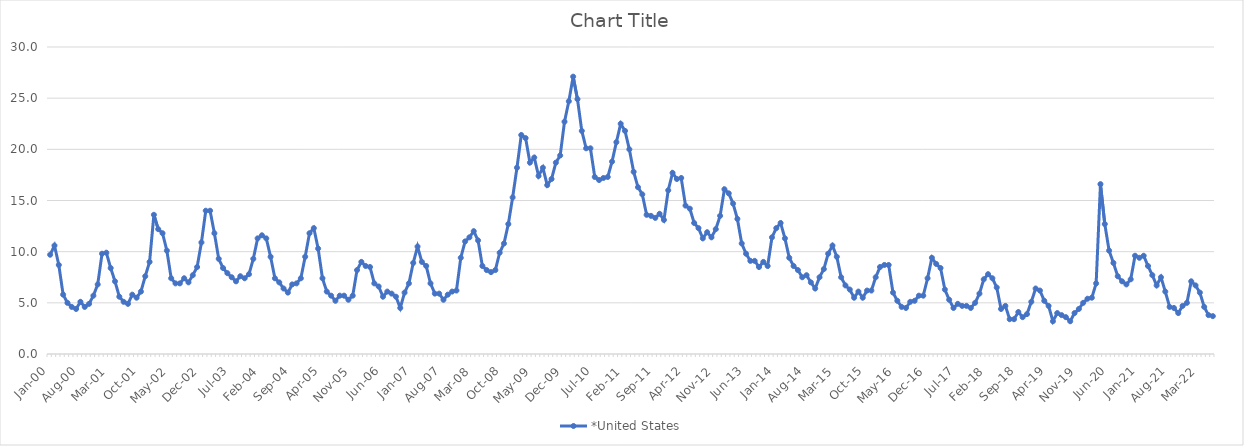
| Category | *United States | Alaska | Alabama | Arkansas | Arizona | California | Colorado | Connecticut | Delaware | Florida | Georgia | Hawaii | Iowa | Idaho | Illinois | Indiana | Kansas | Kentucky | Louisiana | Massachusetts | Maryland | Maine | Michigan | Minnesota | Missouri | Mississippi | Montana | North Carolina | North Dakota | Nebraska | New Hampshire | New Jersey | New Mexico | Nevada | New York | Ohio | Oklahoma | Oregon | Pennsylvania | Rhode Island | South Carolina | South Dakota | Tennessee | Texas | Utah | Virginia | Vermont | Washington | Wisconsin | West Virginia | Wyoming |
|---|---|---|---|---|---|---|---|---|---|---|---|---|---|---|---|---|---|---|---|---|---|---|---|---|---|---|---|---|---|---|---|---|---|---|---|---|---|---|---|---|---|---|---|---|---|---|---|---|---|---|---|
| Jan-00 | 9.7 |  |  |  |  |  |  |  |  |  |  |  |  |  |  |  |  |  |  |  |  |  |  |  |  |  |  |  |  |  |  |  |  |  |  |  |  |  |  |  |  |  |  |  |  |  |  |  |  |  |  |
| Feb-00 | 10.6 |  |  |  |  |  |  |  |  |  |  |  |  |  |  |  |  |  |  |  |  |  |  |  |  |  |  |  |  |  |  |  |  |  |  |  |  |  |  |  |  |  |  |  |  |  |  |  |  |  |  |
| Mar-00 | 8.7 |  |  |  |  |  |  |  |  |  |  |  |  |  |  |  |  |  |  |  |  |  |  |  |  |  |  |  |  |  |  |  |  |  |  |  |  |  |  |  |  |  |  |  |  |  |  |  |  |  |  |
| Apr-00 | 5.8 |  |  |  |  |  |  |  |  |  |  |  |  |  |  |  |  |  |  |  |  |  |  |  |  |  |  |  |  |  |  |  |  |  |  |  |  |  |  |  |  |  |  |  |  |  |  |  |  |  |  |
| May-00 | 5 |  |  |  |  |  |  |  |  |  |  |  |  |  |  |  |  |  |  |  |  |  |  |  |  |  |  |  |  |  |  |  |  |  |  |  |  |  |  |  |  |  |  |  |  |  |  |  |  |  |  |
| Jun-00 | 4.6 |  |  |  |  |  |  |  |  |  |  |  |  |  |  |  |  |  |  |  |  |  |  |  |  |  |  |  |  |  |  |  |  |  |  |  |  |  |  |  |  |  |  |  |  |  |  |  |  |  |  |
| Jul-00 | 4.4 |  |  |  |  |  |  |  |  |  |  |  |  |  |  |  |  |  |  |  |  |  |  |  |  |  |  |  |  |  |  |  |  |  |  |  |  |  |  |  |  |  |  |  |  |  |  |  |  |  |  |
| Aug-00 | 5.1 |  |  |  |  |  |  |  |  |  |  |  |  |  |  |  |  |  |  |  |  |  |  |  |  |  |  |  |  |  |  |  |  |  |  |  |  |  |  |  |  |  |  |  |  |  |  |  |  |  |  |
| Sep-00 | 4.6 |  |  |  |  |  |  |  |  |  |  |  |  |  |  |  |  |  |  |  |  |  |  |  |  |  |  |  |  |  |  |  |  |  |  |  |  |  |  |  |  |  |  |  |  |  |  |  |  |  |  |
| Oct-00 | 4.9 |  |  |  |  |  |  |  |  |  |  |  |  |  |  |  |  |  |  |  |  |  |  |  |  |  |  |  |  |  |  |  |  |  |  |  |  |  |  |  |  |  |  |  |  |  |  |  |  |  |  |
| Nov-00 | 5.7 |  |  |  |  |  |  |  |  |  |  |  |  |  |  |  |  |  |  |  |  |  |  |  |  |  |  |  |  |  |  |  |  |  |  |  |  |  |  |  |  |  |  |  |  |  |  |  |  |  |  |
| Dec-00 | 6.8 |  |  |  |  |  |  |  |  |  |  |  |  |  |  |  |  |  |  |  |  |  |  |  |  |  |  |  |  |  |  |  |  |  |  |  |  |  |  |  |  |  |  |  |  |  |  |  |  |  |  |
| Jan-01 | 9.8 |  |  |  |  |  |  |  |  |  |  |  |  |  |  |  |  |  |  |  |  |  |  |  |  |  |  |  |  |  |  |  |  |  |  |  |  |  |  |  |  |  |  |  |  |  |  |  |  |  |  |
| Feb-01 | 9.9 |  |  |  |  |  |  |  |  |  |  |  |  |  |  |  |  |  |  |  |  |  |  |  |  |  |  |  |  |  |  |  |  |  |  |  |  |  |  |  |  |  |  |  |  |  |  |  |  |  |  |
| Mar-01 | 8.4 |  |  |  |  |  |  |  |  |  |  |  |  |  |  |  |  |  |  |  |  |  |  |  |  |  |  |  |  |  |  |  |  |  |  |  |  |  |  |  |  |  |  |  |  |  |  |  |  |  |  |
| Apr-01 | 7.1 |  |  |  |  |  |  |  |  |  |  |  |  |  |  |  |  |  |  |  |  |  |  |  |  |  |  |  |  |  |  |  |  |  |  |  |  |  |  |  |  |  |  |  |  |  |  |  |  |  |  |
| May-01 | 5.6 |  |  |  |  |  |  |  |  |  |  |  |  |  |  |  |  |  |  |  |  |  |  |  |  |  |  |  |  |  |  |  |  |  |  |  |  |  |  |  |  |  |  |  |  |  |  |  |  |  |  |
| Jun-01 | 5.1 |  |  |  |  |  |  |  |  |  |  |  |  |  |  |  |  |  |  |  |  |  |  |  |  |  |  |  |  |  |  |  |  |  |  |  |  |  |  |  |  |  |  |  |  |  |  |  |  |  |  |
| Jul-01 | 4.9 |  |  |  |  |  |  |  |  |  |  |  |  |  |  |  |  |  |  |  |  |  |  |  |  |  |  |  |  |  |  |  |  |  |  |  |  |  |  |  |  |  |  |  |  |  |  |  |  |  |  |
| Aug-01 | 5.8 |  |  |  |  |  |  |  |  |  |  |  |  |  |  |  |  |  |  |  |  |  |  |  |  |  |  |  |  |  |  |  |  |  |  |  |  |  |  |  |  |  |  |  |  |  |  |  |  |  |  |
| Sep-01 | 5.5 |  |  |  |  |  |  |  |  |  |  |  |  |  |  |  |  |  |  |  |  |  |  |  |  |  |  |  |  |  |  |  |  |  |  |  |  |  |  |  |  |  |  |  |  |  |  |  |  |  |  |
| Oct-01 | 6.1 |  |  |  |  |  |  |  |  |  |  |  |  |  |  |  |  |  |  |  |  |  |  |  |  |  |  |  |  |  |  |  |  |  |  |  |  |  |  |  |  |  |  |  |  |  |  |  |  |  |  |
| Nov-01 | 7.6 |  |  |  |  |  |  |  |  |  |  |  |  |  |  |  |  |  |  |  |  |  |  |  |  |  |  |  |  |  |  |  |  |  |  |  |  |  |  |  |  |  |  |  |  |  |  |  |  |  |  |
| Dec-01 | 9 |  |  |  |  |  |  |  |  |  |  |  |  |  |  |  |  |  |  |  |  |  |  |  |  |  |  |  |  |  |  |  |  |  |  |  |  |  |  |  |  |  |  |  |  |  |  |  |  |  |  |
| Jan-02 | 13.6 |  |  |  |  |  |  |  |  |  |  |  |  |  |  |  |  |  |  |  |  |  |  |  |  |  |  |  |  |  |  |  |  |  |  |  |  |  |  |  |  |  |  |  |  |  |  |  |  |  |  |
| Feb-02 | 12.2 |  |  |  |  |  |  |  |  |  |  |  |  |  |  |  |  |  |  |  |  |  |  |  |  |  |  |  |  |  |  |  |  |  |  |  |  |  |  |  |  |  |  |  |  |  |  |  |  |  |  |
| Mar-02 | 11.8 |  |  |  |  |  |  |  |  |  |  |  |  |  |  |  |  |  |  |  |  |  |  |  |  |  |  |  |  |  |  |  |  |  |  |  |  |  |  |  |  |  |  |  |  |  |  |  |  |  |  |
| Apr-02 | 10.1 |  |  |  |  |  |  |  |  |  |  |  |  |  |  |  |  |  |  |  |  |  |  |  |  |  |  |  |  |  |  |  |  |  |  |  |  |  |  |  |  |  |  |  |  |  |  |  |  |  |  |
| May-02 | 7.4 |  |  |  |  |  |  |  |  |  |  |  |  |  |  |  |  |  |  |  |  |  |  |  |  |  |  |  |  |  |  |  |  |  |  |  |  |  |  |  |  |  |  |  |  |  |  |  |  |  |  |
| Jun-02 | 6.9 |  |  |  |  |  |  |  |  |  |  |  |  |  |  |  |  |  |  |  |  |  |  |  |  |  |  |  |  |  |  |  |  |  |  |  |  |  |  |  |  |  |  |  |  |  |  |  |  |  |  |
| Jul-02 | 6.9 |  |  |  |  |  |  |  |  |  |  |  |  |  |  |  |  |  |  |  |  |  |  |  |  |  |  |  |  |  |  |  |  |  |  |  |  |  |  |  |  |  |  |  |  |  |  |  |  |  |  |
| Aug-02 | 7.4 |  |  |  |  |  |  |  |  |  |  |  |  |  |  |  |  |  |  |  |  |  |  |  |  |  |  |  |  |  |  |  |  |  |  |  |  |  |  |  |  |  |  |  |  |  |  |  |  |  |  |
| Sep-02 | 7 |  |  |  |  |  |  |  |  |  |  |  |  |  |  |  |  |  |  |  |  |  |  |  |  |  |  |  |  |  |  |  |  |  |  |  |  |  |  |  |  |  |  |  |  |  |  |  |  |  |  |
| Oct-02 | 7.7 |  |  |  |  |  |  |  |  |  |  |  |  |  |  |  |  |  |  |  |  |  |  |  |  |  |  |  |  |  |  |  |  |  |  |  |  |  |  |  |  |  |  |  |  |  |  |  |  |  |  |
| Nov-02 | 8.5 |  |  |  |  |  |  |  |  |  |  |  |  |  |  |  |  |  |  |  |  |  |  |  |  |  |  |  |  |  |  |  |  |  |  |  |  |  |  |  |  |  |  |  |  |  |  |  |  |  |  |
| Dec-02 | 10.9 |  |  |  |  |  |  |  |  |  |  |  |  |  |  |  |  |  |  |  |  |  |  |  |  |  |  |  |  |  |  |  |  |  |  |  |  |  |  |  |  |  |  |  |  |  |  |  |  |  |  |
| Jan-03 | 14 |  |  |  |  |  |  |  |  |  |  |  |  |  |  |  |  |  |  |  |  |  |  |  |  |  |  |  |  |  |  |  |  |  |  |  |  |  |  |  |  |  |  |  |  |  |  |  |  |  |  |
| Feb-03 | 14 |  |  |  |  |  |  |  |  |  |  |  |  |  |  |  |  |  |  |  |  |  |  |  |  |  |  |  |  |  |  |  |  |  |  |  |  |  |  |  |  |  |  |  |  |  |  |  |  |  |  |
| Mar-03 | 11.8 |  |  |  |  |  |  |  |  |  |  |  |  |  |  |  |  |  |  |  |  |  |  |  |  |  |  |  |  |  |  |  |  |  |  |  |  |  |  |  |  |  |  |  |  |  |  |  |  |  |  |
| Apr-03 | 9.3 |  |  |  |  |  |  |  |  |  |  |  |  |  |  |  |  |  |  |  |  |  |  |  |  |  |  |  |  |  |  |  |  |  |  |  |  |  |  |  |  |  |  |  |  |  |  |  |  |  |  |
| May-03 | 8.4 |  |  |  |  |  |  |  |  |  |  |  |  |  |  |  |  |  |  |  |  |  |  |  |  |  |  |  |  |  |  |  |  |  |  |  |  |  |  |  |  |  |  |  |  |  |  |  |  |  |  |
| Jun-03 | 7.9 |  |  |  |  |  |  |  |  |  |  |  |  |  |  |  |  |  |  |  |  |  |  |  |  |  |  |  |  |  |  |  |  |  |  |  |  |  |  |  |  |  |  |  |  |  |  |  |  |  |  |
| Jul-03 | 7.5 |  |  |  |  |  |  |  |  |  |  |  |  |  |  |  |  |  |  |  |  |  |  |  |  |  |  |  |  |  |  |  |  |  |  |  |  |  |  |  |  |  |  |  |  |  |  |  |  |  |  |
| Aug-03 | 7.1 |  |  |  |  |  |  |  |  |  |  |  |  |  |  |  |  |  |  |  |  |  |  |  |  |  |  |  |  |  |  |  |  |  |  |  |  |  |  |  |  |  |  |  |  |  |  |  |  |  |  |
| Sep-03 | 7.6 |  |  |  |  |  |  |  |  |  |  |  |  |  |  |  |  |  |  |  |  |  |  |  |  |  |  |  |  |  |  |  |  |  |  |  |  |  |  |  |  |  |  |  |  |  |  |  |  |  |  |
| Oct-03 | 7.4 |  |  |  |  |  |  |  |  |  |  |  |  |  |  |  |  |  |  |  |  |  |  |  |  |  |  |  |  |  |  |  |  |  |  |  |  |  |  |  |  |  |  |  |  |  |  |  |  |  |  |
| Nov-03 | 7.8 |  |  |  |  |  |  |  |  |  |  |  |  |  |  |  |  |  |  |  |  |  |  |  |  |  |  |  |  |  |  |  |  |  |  |  |  |  |  |  |  |  |  |  |  |  |  |  |  |  |  |
| Dec-03 | 9.3 |  |  |  |  |  |  |  |  |  |  |  |  |  |  |  |  |  |  |  |  |  |  |  |  |  |  |  |  |  |  |  |  |  |  |  |  |  |  |  |  |  |  |  |  |  |  |  |  |  |  |
| Jan-04 | 11.3 |  |  |  |  |  |  |  |  |  |  |  |  |  |  |  |  |  |  |  |  |  |  |  |  |  |  |  |  |  |  |  |  |  |  |  |  |  |  |  |  |  |  |  |  |  |  |  |  |  |  |
| Feb-04 | 11.6 |  |  |  |  |  |  |  |  |  |  |  |  |  |  |  |  |  |  |  |  |  |  |  |  |  |  |  |  |  |  |  |  |  |  |  |  |  |  |  |  |  |  |  |  |  |  |  |  |  |  |
| Mar-04 | 11.3 |  |  |  |  |  |  |  |  |  |  |  |  |  |  |  |  |  |  |  |  |  |  |  |  |  |  |  |  |  |  |  |  |  |  |  |  |  |  |  |  |  |  |  |  |  |  |  |  |  |  |
| Apr-04 | 9.5 |  |  |  |  |  |  |  |  |  |  |  |  |  |  |  |  |  |  |  |  |  |  |  |  |  |  |  |  |  |  |  |  |  |  |  |  |  |  |  |  |  |  |  |  |  |  |  |  |  |  |
| May-04 | 7.4 |  |  |  |  |  |  |  |  |  |  |  |  |  |  |  |  |  |  |  |  |  |  |  |  |  |  |  |  |  |  |  |  |  |  |  |  |  |  |  |  |  |  |  |  |  |  |  |  |  |  |
| Jun-04 | 7 |  |  |  |  |  |  |  |  |  |  |  |  |  |  |  |  |  |  |  |  |  |  |  |  |  |  |  |  |  |  |  |  |  |  |  |  |  |  |  |  |  |  |  |  |  |  |  |  |  |  |
| Jul-04 | 6.4 |  |  |  |  |  |  |  |  |  |  |  |  |  |  |  |  |  |  |  |  |  |  |  |  |  |  |  |  |  |  |  |  |  |  |  |  |  |  |  |  |  |  |  |  |  |  |  |  |  |  |
| Aug-04 | 6 |  |  |  |  |  |  |  |  |  |  |  |  |  |  |  |  |  |  |  |  |  |  |  |  |  |  |  |  |  |  |  |  |  |  |  |  |  |  |  |  |  |  |  |  |  |  |  |  |  |  |
| Sep-04 | 6.8 |  |  |  |  |  |  |  |  |  |  |  |  |  |  |  |  |  |  |  |  |  |  |  |  |  |  |  |  |  |  |  |  |  |  |  |  |  |  |  |  |  |  |  |  |  |  |  |  |  |  |
| Oct-04 | 6.9 |  |  |  |  |  |  |  |  |  |  |  |  |  |  |  |  |  |  |  |  |  |  |  |  |  |  |  |  |  |  |  |  |  |  |  |  |  |  |  |  |  |  |  |  |  |  |  |  |  |  |
| Nov-04 | 7.4 |  |  |  |  |  |  |  |  |  |  |  |  |  |  |  |  |  |  |  |  |  |  |  |  |  |  |  |  |  |  |  |  |  |  |  |  |  |  |  |  |  |  |  |  |  |  |  |  |  |  |
| Dec-04 | 9.5 |  |  |  |  |  |  |  |  |  |  |  |  |  |  |  |  |  |  |  |  |  |  |  |  |  |  |  |  |  |  |  |  |  |  |  |  |  |  |  |  |  |  |  |  |  |  |  |  |  |  |
| Jan-05 | 11.8 |  |  |  |  |  |  |  |  |  |  |  |  |  |  |  |  |  |  |  |  |  |  |  |  |  |  |  |  |  |  |  |  |  |  |  |  |  |  |  |  |  |  |  |  |  |  |  |  |  |  |
| Feb-05 | 12.3 |  |  |  |  |  |  |  |  |  |  |  |  |  |  |  |  |  |  |  |  |  |  |  |  |  |  |  |  |  |  |  |  |  |  |  |  |  |  |  |  |  |  |  |  |  |  |  |  |  |  |
| Mar-05 | 10.3 |  |  |  |  |  |  |  |  |  |  |  |  |  |  |  |  |  |  |  |  |  |  |  |  |  |  |  |  |  |  |  |  |  |  |  |  |  |  |  |  |  |  |  |  |  |  |  |  |  |  |
| Apr-05 | 7.4 |  |  |  |  |  |  |  |  |  |  |  |  |  |  |  |  |  |  |  |  |  |  |  |  |  |  |  |  |  |  |  |  |  |  |  |  |  |  |  |  |  |  |  |  |  |  |  |  |  |  |
| May-05 | 6.1 |  |  |  |  |  |  |  |  |  |  |  |  |  |  |  |  |  |  |  |  |  |  |  |  |  |  |  |  |  |  |  |  |  |  |  |  |  |  |  |  |  |  |  |  |  |  |  |  |  |  |
| Jun-05 | 5.7 |  |  |  |  |  |  |  |  |  |  |  |  |  |  |  |  |  |  |  |  |  |  |  |  |  |  |  |  |  |  |  |  |  |  |  |  |  |  |  |  |  |  |  |  |  |  |  |  |  |  |
| Jul-05 | 5.2 |  |  |  |  |  |  |  |  |  |  |  |  |  |  |  |  |  |  |  |  |  |  |  |  |  |  |  |  |  |  |  |  |  |  |  |  |  |  |  |  |  |  |  |  |  |  |  |  |  |  |
| Aug-05 | 5.7 |  |  |  |  |  |  |  |  |  |  |  |  |  |  |  |  |  |  |  |  |  |  |  |  |  |  |  |  |  |  |  |  |  |  |  |  |  |  |  |  |  |  |  |  |  |  |  |  |  |  |
| Sep-05 | 5.7 |  |  |  |  |  |  |  |  |  |  |  |  |  |  |  |  |  |  |  |  |  |  |  |  |  |  |  |  |  |  |  |  |  |  |  |  |  |  |  |  |  |  |  |  |  |  |  |  |  |  |
| Oct-05 | 5.3 |  |  |  |  |  |  |  |  |  |  |  |  |  |  |  |  |  |  |  |  |  |  |  |  |  |  |  |  |  |  |  |  |  |  |  |  |  |  |  |  |  |  |  |  |  |  |  |  |  |  |
| Nov-05 | 5.7 |  |  |  |  |  |  |  |  |  |  |  |  |  |  |  |  |  |  |  |  |  |  |  |  |  |  |  |  |  |  |  |  |  |  |  |  |  |  |  |  |  |  |  |  |  |  |  |  |  |  |
| Dec-05 | 8.2 |  |  |  |  |  |  |  |  |  |  |  |  |  |  |  |  |  |  |  |  |  |  |  |  |  |  |  |  |  |  |  |  |  |  |  |  |  |  |  |  |  |  |  |  |  |  |  |  |  |  |
| Jan-06 | 9 |  |  |  |  |  |  |  |  |  |  |  |  |  |  |  |  |  |  |  |  |  |  |  |  |  |  |  |  |  |  |  |  |  |  |  |  |  |  |  |  |  |  |  |  |  |  |  |  |  |  |
| Feb-06 | 8.6 |  |  |  |  |  |  |  |  |  |  |  |  |  |  |  |  |  |  |  |  |  |  |  |  |  |  |  |  |  |  |  |  |  |  |  |  |  |  |  |  |  |  |  |  |  |  |  |  |  |  |
| Mar-06 | 8.5 |  |  |  |  |  |  |  |  |  |  |  |  |  |  |  |  |  |  |  |  |  |  |  |  |  |  |  |  |  |  |  |  |  |  |  |  |  |  |  |  |  |  |  |  |  |  |  |  |  |  |
| Apr-06 | 6.9 |  |  |  |  |  |  |  |  |  |  |  |  |  |  |  |  |  |  |  |  |  |  |  |  |  |  |  |  |  |  |  |  |  |  |  |  |  |  |  |  |  |  |  |  |  |  |  |  |  |  |
| May-06 | 6.6 |  |  |  |  |  |  |  |  |  |  |  |  |  |  |  |  |  |  |  |  |  |  |  |  |  |  |  |  |  |  |  |  |  |  |  |  |  |  |  |  |  |  |  |  |  |  |  |  |  |  |
| Jun-06 | 5.6 |  |  |  |  |  |  |  |  |  |  |  |  |  |  |  |  |  |  |  |  |  |  |  |  |  |  |  |  |  |  |  |  |  |  |  |  |  |  |  |  |  |  |  |  |  |  |  |  |  |  |
| Jul-06 | 6.1 |  |  |  |  |  |  |  |  |  |  |  |  |  |  |  |  |  |  |  |  |  |  |  |  |  |  |  |  |  |  |  |  |  |  |  |  |  |  |  |  |  |  |  |  |  |  |  |  |  |  |
| Aug-06 | 5.9 |  |  |  |  |  |  |  |  |  |  |  |  |  |  |  |  |  |  |  |  |  |  |  |  |  |  |  |  |  |  |  |  |  |  |  |  |  |  |  |  |  |  |  |  |  |  |  |  |  |  |
| Sep-06 | 5.6 |  |  |  |  |  |  |  |  |  |  |  |  |  |  |  |  |  |  |  |  |  |  |  |  |  |  |  |  |  |  |  |  |  |  |  |  |  |  |  |  |  |  |  |  |  |  |  |  |  |  |
| Oct-06 | 4.5 |  |  |  |  |  |  |  |  |  |  |  |  |  |  |  |  |  |  |  |  |  |  |  |  |  |  |  |  |  |  |  |  |  |  |  |  |  |  |  |  |  |  |  |  |  |  |  |  |  |  |
| Nov-06 | 6 |  |  |  |  |  |  |  |  |  |  |  |  |  |  |  |  |  |  |  |  |  |  |  |  |  |  |  |  |  |  |  |  |  |  |  |  |  |  |  |  |  |  |  |  |  |  |  |  |  |  |
| Dec-06 | 6.9 |  |  |  |  |  |  |  |  |  |  |  |  |  |  |  |  |  |  |  |  |  |  |  |  |  |  |  |  |  |  |  |  |  |  |  |  |  |  |  |  |  |  |  |  |  |  |  |  |  |  |
| Jan-07 | 8.9 |  |  |  |  |  |  |  |  |  |  |  |  |  |  |  |  |  |  |  |  |  |  |  |  |  |  |  |  |  |  |  |  |  |  |  |  |  |  |  |  |  |  |  |  |  |  |  |  |  |  |
| Feb-07 | 10.5 |  |  |  |  |  |  |  |  |  |  |  |  |  |  |  |  |  |  |  |  |  |  |  |  |  |  |  |  |  |  |  |  |  |  |  |  |  |  |  |  |  |  |  |  |  |  |  |  |  |  |
| Mar-07 | 9 |  |  |  |  |  |  |  |  |  |  |  |  |  |  |  |  |  |  |  |  |  |  |  |  |  |  |  |  |  |  |  |  |  |  |  |  |  |  |  |  |  |  |  |  |  |  |  |  |  |  |
| Apr-07 | 8.6 |  |  |  |  |  |  |  |  |  |  |  |  |  |  |  |  |  |  |  |  |  |  |  |  |  |  |  |  |  |  |  |  |  |  |  |  |  |  |  |  |  |  |  |  |  |  |  |  |  |  |
| May-07 | 6.9 |  |  |  |  |  |  |  |  |  |  |  |  |  |  |  |  |  |  |  |  |  |  |  |  |  |  |  |  |  |  |  |  |  |  |  |  |  |  |  |  |  |  |  |  |  |  |  |  |  |  |
| Jun-07 | 5.9 |  |  |  |  |  |  |  |  |  |  |  |  |  |  |  |  |  |  |  |  |  |  |  |  |  |  |  |  |  |  |  |  |  |  |  |  |  |  |  |  |  |  |  |  |  |  |  |  |  |  |
| Jul-07 | 5.9 |  |  |  |  |  |  |  |  |  |  |  |  |  |  |  |  |  |  |  |  |  |  |  |  |  |  |  |  |  |  |  |  |  |  |  |  |  |  |  |  |  |  |  |  |  |  |  |  |  |  |
| Aug-07 | 5.3 |  |  |  |  |  |  |  |  |  |  |  |  |  |  |  |  |  |  |  |  |  |  |  |  |  |  |  |  |  |  |  |  |  |  |  |  |  |  |  |  |  |  |  |  |  |  |  |  |  |  |
| Sep-07 | 5.8 |  |  |  |  |  |  |  |  |  |  |  |  |  |  |  |  |  |  |  |  |  |  |  |  |  |  |  |  |  |  |  |  |  |  |  |  |  |  |  |  |  |  |  |  |  |  |  |  |  |  |
| Oct-07 | 6.1 |  |  |  |  |  |  |  |  |  |  |  |  |  |  |  |  |  |  |  |  |  |  |  |  |  |  |  |  |  |  |  |  |  |  |  |  |  |  |  |  |  |  |  |  |  |  |  |  |  |  |
| Nov-07 | 6.2 |  |  |  |  |  |  |  |  |  |  |  |  |  |  |  |  |  |  |  |  |  |  |  |  |  |  |  |  |  |  |  |  |  |  |  |  |  |  |  |  |  |  |  |  |  |  |  |  |  |  |
| Dec-07 | 9.4 |  |  |  |  |  |  |  |  |  |  |  |  |  |  |  |  |  |  |  |  |  |  |  |  |  |  |  |  |  |  |  |  |  |  |  |  |  |  |  |  |  |  |  |  |  |  |  |  |  |  |
| Jan-08 | 11 |  |  |  |  |  |  |  |  |  |  |  |  |  |  |  |  |  |  |  |  |  |  |  |  |  |  |  |  |  |  |  |  |  |  |  |  |  |  |  |  |  |  |  |  |  |  |  |  |  |  |
| Feb-08 | 11.4 |  |  |  |  |  |  |  |  |  |  |  |  |  |  |  |  |  |  |  |  |  |  |  |  |  |  |  |  |  |  |  |  |  |  |  |  |  |  |  |  |  |  |  |  |  |  |  |  |  |  |
| Mar-08 | 12 |  |  |  |  |  |  |  |  |  |  |  |  |  |  |  |  |  |  |  |  |  |  |  |  |  |  |  |  |  |  |  |  |  |  |  |  |  |  |  |  |  |  |  |  |  |  |  |  |  |  |
| Apr-08 | 11.1 |  |  |  |  |  |  |  |  |  |  |  |  |  |  |  |  |  |  |  |  |  |  |  |  |  |  |  |  |  |  |  |  |  |  |  |  |  |  |  |  |  |  |  |  |  |  |  |  |  |  |
| May-08 | 8.6 |  |  |  |  |  |  |  |  |  |  |  |  |  |  |  |  |  |  |  |  |  |  |  |  |  |  |  |  |  |  |  |  |  |  |  |  |  |  |  |  |  |  |  |  |  |  |  |  |  |  |
| Jun-08 | 8.2 |  |  |  |  |  |  |  |  |  |  |  |  |  |  |  |  |  |  |  |  |  |  |  |  |  |  |  |  |  |  |  |  |  |  |  |  |  |  |  |  |  |  |  |  |  |  |  |  |  |  |
| Jul-08 | 8 |  |  |  |  |  |  |  |  |  |  |  |  |  |  |  |  |  |  |  |  |  |  |  |  |  |  |  |  |  |  |  |  |  |  |  |  |  |  |  |  |  |  |  |  |  |  |  |  |  |  |
| Aug-08 | 8.2 |  |  |  |  |  |  |  |  |  |  |  |  |  |  |  |  |  |  |  |  |  |  |  |  |  |  |  |  |  |  |  |  |  |  |  |  |  |  |  |  |  |  |  |  |  |  |  |  |  |  |
| Sep-08 | 9.9 |  |  |  |  |  |  |  |  |  |  |  |  |  |  |  |  |  |  |  |  |  |  |  |  |  |  |  |  |  |  |  |  |  |  |  |  |  |  |  |  |  |  |  |  |  |  |  |  |  |  |
| Oct-08 | 10.8 |  |  |  |  |  |  |  |  |  |  |  |  |  |  |  |  |  |  |  |  |  |  |  |  |  |  |  |  |  |  |  |  |  |  |  |  |  |  |  |  |  |  |  |  |  |  |  |  |  |  |
| Nov-08 | 12.7 |  |  |  |  |  |  |  |  |  |  |  |  |  |  |  |  |  |  |  |  |  |  |  |  |  |  |  |  |  |  |  |  |  |  |  |  |  |  |  |  |  |  |  |  |  |  |  |  |  |  |
| Dec-08 | 15.3 |  |  |  |  |  |  |  |  |  |  |  |  |  |  |  |  |  |  |  |  |  |  |  |  |  |  |  |  |  |  |  |  |  |  |  |  |  |  |  |  |  |  |  |  |  |  |  |  |  |  |
| Jan-09 | 18.2 |  |  |  |  |  |  |  |  |  |  |  |  |  |  |  |  |  |  |  |  |  |  |  |  |  |  |  |  |  |  |  |  |  |  |  |  |  |  |  |  |  |  |  |  |  |  |  |  |  |  |
| Feb-09 | 21.4 |  |  |  |  |  |  |  |  |  |  |  |  |  |  |  |  |  |  |  |  |  |  |  |  |  |  |  |  |  |  |  |  |  |  |  |  |  |  |  |  |  |  |  |  |  |  |  |  |  |  |
| Mar-09 | 21.1 |  |  |  |  |  |  |  |  |  |  |  |  |  |  |  |  |  |  |  |  |  |  |  |  |  |  |  |  |  |  |  |  |  |  |  |  |  |  |  |  |  |  |  |  |  |  |  |  |  |  |
| Apr-09 | 18.7 |  |  |  |  |  |  |  |  |  |  |  |  |  |  |  |  |  |  |  |  |  |  |  |  |  |  |  |  |  |  |  |  |  |  |  |  |  |  |  |  |  |  |  |  |  |  |  |  |  |  |
| May-09 | 19.2 |  |  |  |  |  |  |  |  |  |  |  |  |  |  |  |  |  |  |  |  |  |  |  |  |  |  |  |  |  |  |  |  |  |  |  |  |  |  |  |  |  |  |  |  |  |  |  |  |  |  |
| Jun-09 | 17.4 |  |  |  |  |  |  |  |  |  |  |  |  |  |  |  |  |  |  |  |  |  |  |  |  |  |  |  |  |  |  |  |  |  |  |  |  |  |  |  |  |  |  |  |  |  |  |  |  |  |  |
| Jul-09 | 18.2 |  |  |  |  |  |  |  |  |  |  |  |  |  |  |  |  |  |  |  |  |  |  |  |  |  |  |  |  |  |  |  |  |  |  |  |  |  |  |  |  |  |  |  |  |  |  |  |  |  |  |
| Aug-09 | 16.5 |  |  |  |  |  |  |  |  |  |  |  |  |  |  |  |  |  |  |  |  |  |  |  |  |  |  |  |  |  |  |  |  |  |  |  |  |  |  |  |  |  |  |  |  |  |  |  |  |  |  |
| Sep-09 | 17.1 |  |  |  |  |  |  |  |  |  |  |  |  |  |  |  |  |  |  |  |  |  |  |  |  |  |  |  |  |  |  |  |  |  |  |  |  |  |  |  |  |  |  |  |  |  |  |  |  |  |  |
| Oct-09 | 18.7 |  |  |  |  |  |  |  |  |  |  |  |  |  |  |  |  |  |  |  |  |  |  |  |  |  |  |  |  |  |  |  |  |  |  |  |  |  |  |  |  |  |  |  |  |  |  |  |  |  |  |
| Nov-09 | 19.4 |  |  |  |  |  |  |  |  |  |  |  |  |  |  |  |  |  |  |  |  |  |  |  |  |  |  |  |  |  |  |  |  |  |  |  |  |  |  |  |  |  |  |  |  |  |  |  |  |  |  |
| Dec-09 | 22.7 |  |  |  |  |  |  |  |  |  |  |  |  |  |  |  |  |  |  |  |  |  |  |  |  |  |  |  |  |  |  |  |  |  |  |  |  |  |  |  |  |  |  |  |  |  |  |  |  |  |  |
| Jan-10 | 24.7 |  |  |  |  |  |  |  |  |  |  |  |  |  |  |  |  |  |  |  |  |  |  |  |  |  |  |  |  |  |  |  |  |  |  |  |  |  |  |  |  |  |  |  |  |  |  |  |  |  |  |
| Feb-10 | 27.1 |  |  |  |  |  |  |  |  |  |  |  |  |  |  |  |  |  |  |  |  |  |  |  |  |  |  |  |  |  |  |  |  |  |  |  |  |  |  |  |  |  |  |  |  |  |  |  |  |  |  |
| Mar-10 | 24.9 |  |  |  |  |  |  |  |  |  |  |  |  |  |  |  |  |  |  |  |  |  |  |  |  |  |  |  |  |  |  |  |  |  |  |  |  |  |  |  |  |  |  |  |  |  |  |  |  |  |  |
| Apr-10 | 21.8 |  |  |  |  |  |  |  |  |  |  |  |  |  |  |  |  |  |  |  |  |  |  |  |  |  |  |  |  |  |  |  |  |  |  |  |  |  |  |  |  |  |  |  |  |  |  |  |  |  |  |
| May-10 | 20.1 |  |  |  |  |  |  |  |  |  |  |  |  |  |  |  |  |  |  |  |  |  |  |  |  |  |  |  |  |  |  |  |  |  |  |  |  |  |  |  |  |  |  |  |  |  |  |  |  |  |  |
| Jun-10 | 20.1 |  |  |  |  |  |  |  |  |  |  |  |  |  |  |  |  |  |  |  |  |  |  |  |  |  |  |  |  |  |  |  |  |  |  |  |  |  |  |  |  |  |  |  |  |  |  |  |  |  |  |
| Jul-10 | 17.3 |  |  |  |  |  |  |  |  |  |  |  |  |  |  |  |  |  |  |  |  |  |  |  |  |  |  |  |  |  |  |  |  |  |  |  |  |  |  |  |  |  |  |  |  |  |  |  |  |  |  |
| Aug-10 | 17 |  |  |  |  |  |  |  |  |  |  |  |  |  |  |  |  |  |  |  |  |  |  |  |  |  |  |  |  |  |  |  |  |  |  |  |  |  |  |  |  |  |  |  |  |  |  |  |  |  |  |
| Sep-10 | 17.2 |  |  |  |  |  |  |  |  |  |  |  |  |  |  |  |  |  |  |  |  |  |  |  |  |  |  |  |  |  |  |  |  |  |  |  |  |  |  |  |  |  |  |  |  |  |  |  |  |  |  |
| Oct-10 | 17.3 |  |  |  |  |  |  |  |  |  |  |  |  |  |  |  |  |  |  |  |  |  |  |  |  |  |  |  |  |  |  |  |  |  |  |  |  |  |  |  |  |  |  |  |  |  |  |  |  |  |  |
| Nov-10 | 18.8 |  |  |  |  |  |  |  |  |  |  |  |  |  |  |  |  |  |  |  |  |  |  |  |  |  |  |  |  |  |  |  |  |  |  |  |  |  |  |  |  |  |  |  |  |  |  |  |  |  |  |
| Dec-10 | 20.7 |  |  |  |  |  |  |  |  |  |  |  |  |  |  |  |  |  |  |  |  |  |  |  |  |  |  |  |  |  |  |  |  |  |  |  |  |  |  |  |  |  |  |  |  |  |  |  |  |  |  |
| Jan-11 | 22.5 |  |  |  |  |  |  |  |  |  |  |  |  |  |  |  |  |  |  |  |  |  |  |  |  |  |  |  |  |  |  |  |  |  |  |  |  |  |  |  |  |  |  |  |  |  |  |  |  |  |  |
| Feb-11 | 21.8 |  |  |  |  |  |  |  |  |  |  |  |  |  |  |  |  |  |  |  |  |  |  |  |  |  |  |  |  |  |  |  |  |  |  |  |  |  |  |  |  |  |  |  |  |  |  |  |  |  |  |
| Mar-11 | 20 |  |  |  |  |  |  |  |  |  |  |  |  |  |  |  |  |  |  |  |  |  |  |  |  |  |  |  |  |  |  |  |  |  |  |  |  |  |  |  |  |  |  |  |  |  |  |  |  |  |  |
| Apr-11 | 17.8 |  |  |  |  |  |  |  |  |  |  |  |  |  |  |  |  |  |  |  |  |  |  |  |  |  |  |  |  |  |  |  |  |  |  |  |  |  |  |  |  |  |  |  |  |  |  |  |  |  |  |
| May-11 | 16.3 |  |  |  |  |  |  |  |  |  |  |  |  |  |  |  |  |  |  |  |  |  |  |  |  |  |  |  |  |  |  |  |  |  |  |  |  |  |  |  |  |  |  |  |  |  |  |  |  |  |  |
| Jun-11 | 15.6 |  |  |  |  |  |  |  |  |  |  |  |  |  |  |  |  |  |  |  |  |  |  |  |  |  |  |  |  |  |  |  |  |  |  |  |  |  |  |  |  |  |  |  |  |  |  |  |  |  |  |
| Jul-11 | 13.6 |  |  |  |  |  |  |  |  |  |  |  |  |  |  |  |  |  |  |  |  |  |  |  |  |  |  |  |  |  |  |  |  |  |  |  |  |  |  |  |  |  |  |  |  |  |  |  |  |  |  |
| Aug-11 | 13.5 |  |  |  |  |  |  |  |  |  |  |  |  |  |  |  |  |  |  |  |  |  |  |  |  |  |  |  |  |  |  |  |  |  |  |  |  |  |  |  |  |  |  |  |  |  |  |  |  |  |  |
| Sep-11 | 13.3 |  |  |  |  |  |  |  |  |  |  |  |  |  |  |  |  |  |  |  |  |  |  |  |  |  |  |  |  |  |  |  |  |  |  |  |  |  |  |  |  |  |  |  |  |  |  |  |  |  |  |
| Oct-11 | 13.7 |  |  |  |  |  |  |  |  |  |  |  |  |  |  |  |  |  |  |  |  |  |  |  |  |  |  |  |  |  |  |  |  |  |  |  |  |  |  |  |  |  |  |  |  |  |  |  |  |  |  |
| Nov-11 | 13.1 |  |  |  |  |  |  |  |  |  |  |  |  |  |  |  |  |  |  |  |  |  |  |  |  |  |  |  |  |  |  |  |  |  |  |  |  |  |  |  |  |  |  |  |  |  |  |  |  |  |  |
| Dec-11 | 16 |  |  |  |  |  |  |  |  |  |  |  |  |  |  |  |  |  |  |  |  |  |  |  |  |  |  |  |  |  |  |  |  |  |  |  |  |  |  |  |  |  |  |  |  |  |  |  |  |  |  |
| Jan-12 | 17.7 |  |  |  |  |  |  |  |  |  |  |  |  |  |  |  |  |  |  |  |  |  |  |  |  |  |  |  |  |  |  |  |  |  |  |  |  |  |  |  |  |  |  |  |  |  |  |  |  |  |  |
| Feb-12 | 17.1 |  |  |  |  |  |  |  |  |  |  |  |  |  |  |  |  |  |  |  |  |  |  |  |  |  |  |  |  |  |  |  |  |  |  |  |  |  |  |  |  |  |  |  |  |  |  |  |  |  |  |
| Mar-12 | 17.2 |  |  |  |  |  |  |  |  |  |  |  |  |  |  |  |  |  |  |  |  |  |  |  |  |  |  |  |  |  |  |  |  |  |  |  |  |  |  |  |  |  |  |  |  |  |  |  |  |  |  |
| Apr-12 | 14.5 |  |  |  |  |  |  |  |  |  |  |  |  |  |  |  |  |  |  |  |  |  |  |  |  |  |  |  |  |  |  |  |  |  |  |  |  |  |  |  |  |  |  |  |  |  |  |  |  |  |  |
| May-12 | 14.2 |  |  |  |  |  |  |  |  |  |  |  |  |  |  |  |  |  |  |  |  |  |  |  |  |  |  |  |  |  |  |  |  |  |  |  |  |  |  |  |  |  |  |  |  |  |  |  |  |  |  |
| Jun-12 | 12.8 |  |  |  |  |  |  |  |  |  |  |  |  |  |  |  |  |  |  |  |  |  |  |  |  |  |  |  |  |  |  |  |  |  |  |  |  |  |  |  |  |  |  |  |  |  |  |  |  |  |  |
| Jul-12 | 12.3 |  |  |  |  |  |  |  |  |  |  |  |  |  |  |  |  |  |  |  |  |  |  |  |  |  |  |  |  |  |  |  |  |  |  |  |  |  |  |  |  |  |  |  |  |  |  |  |  |  |  |
| Aug-12 | 11.3 |  |  |  |  |  |  |  |  |  |  |  |  |  |  |  |  |  |  |  |  |  |  |  |  |  |  |  |  |  |  |  |  |  |  |  |  |  |  |  |  |  |  |  |  |  |  |  |  |  |  |
| Sep-12 | 11.9 |  |  |  |  |  |  |  |  |  |  |  |  |  |  |  |  |  |  |  |  |  |  |  |  |  |  |  |  |  |  |  |  |  |  |  |  |  |  |  |  |  |  |  |  |  |  |  |  |  |  |
| Oct-12 | 11.4 |  |  |  |  |  |  |  |  |  |  |  |  |  |  |  |  |  |  |  |  |  |  |  |  |  |  |  |  |  |  |  |  |  |  |  |  |  |  |  |  |  |  |  |  |  |  |  |  |  |  |
| Nov-12 | 12.2 |  |  |  |  |  |  |  |  |  |  |  |  |  |  |  |  |  |  |  |  |  |  |  |  |  |  |  |  |  |  |  |  |  |  |  |  |  |  |  |  |  |  |  |  |  |  |  |  |  |  |
| Dec-12 | 13.5 |  |  |  |  |  |  |  |  |  |  |  |  |  |  |  |  |  |  |  |  |  |  |  |  |  |  |  |  |  |  |  |  |  |  |  |  |  |  |  |  |  |  |  |  |  |  |  |  |  |  |
| Jan-13 | 16.1 |  |  |  |  |  |  |  |  |  |  |  |  |  |  |  |  |  |  |  |  |  |  |  |  |  |  |  |  |  |  |  |  |  |  |  |  |  |  |  |  |  |  |  |  |  |  |  |  |  |  |
| Feb-13 | 15.7 |  |  |  |  |  |  |  |  |  |  |  |  |  |  |  |  |  |  |  |  |  |  |  |  |  |  |  |  |  |  |  |  |  |  |  |  |  |  |  |  |  |  |  |  |  |  |  |  |  |  |
| Mar-13 | 14.7 |  |  |  |  |  |  |  |  |  |  |  |  |  |  |  |  |  |  |  |  |  |  |  |  |  |  |  |  |  |  |  |  |  |  |  |  |  |  |  |  |  |  |  |  |  |  |  |  |  |  |
| Apr-13 | 13.2 |  |  |  |  |  |  |  |  |  |  |  |  |  |  |  |  |  |  |  |  |  |  |  |  |  |  |  |  |  |  |  |  |  |  |  |  |  |  |  |  |  |  |  |  |  |  |  |  |  |  |
| May-13 | 10.8 |  |  |  |  |  |  |  |  |  |  |  |  |  |  |  |  |  |  |  |  |  |  |  |  |  |  |  |  |  |  |  |  |  |  |  |  |  |  |  |  |  |  |  |  |  |  |  |  |  |  |
| Jun-13 | 9.8 |  |  |  |  |  |  |  |  |  |  |  |  |  |  |  |  |  |  |  |  |  |  |  |  |  |  |  |  |  |  |  |  |  |  |  |  |  |  |  |  |  |  |  |  |  |  |  |  |  |  |
| Jul-13 | 9.1 |  |  |  |  |  |  |  |  |  |  |  |  |  |  |  |  |  |  |  |  |  |  |  |  |  |  |  |  |  |  |  |  |  |  |  |  |  |  |  |  |  |  |  |  |  |  |  |  |  |  |
| Aug-13 | 9.1 |  |  |  |  |  |  |  |  |  |  |  |  |  |  |  |  |  |  |  |  |  |  |  |  |  |  |  |  |  |  |  |  |  |  |  |  |  |  |  |  |  |  |  |  |  |  |  |  |  |  |
| Sep-13 | 8.5 |  |  |  |  |  |  |  |  |  |  |  |  |  |  |  |  |  |  |  |  |  |  |  |  |  |  |  |  |  |  |  |  |  |  |  |  |  |  |  |  |  |  |  |  |  |  |  |  |  |  |
| Oct-13 | 9 |  |  |  |  |  |  |  |  |  |  |  |  |  |  |  |  |  |  |  |  |  |  |  |  |  |  |  |  |  |  |  |  |  |  |  |  |  |  |  |  |  |  |  |  |  |  |  |  |  |  |
| Nov-13 | 8.6 |  |  |  |  |  |  |  |  |  |  |  |  |  |  |  |  |  |  |  |  |  |  |  |  |  |  |  |  |  |  |  |  |  |  |  |  |  |  |  |  |  |  |  |  |  |  |  |  |  |  |
| Dec-13 | 11.4 |  |  |  |  |  |  |  |  |  |  |  |  |  |  |  |  |  |  |  |  |  |  |  |  |  |  |  |  |  |  |  |  |  |  |  |  |  |  |  |  |  |  |  |  |  |  |  |  |  |  |
| Jan-14 | 12.3 |  |  |  |  |  |  |  |  |  |  |  |  |  |  |  |  |  |  |  |  |  |  |  |  |  |  |  |  |  |  |  |  |  |  |  |  |  |  |  |  |  |  |  |  |  |  |  |  |  |  |
| Feb-14 | 12.8 |  |  |  |  |  |  |  |  |  |  |  |  |  |  |  |  |  |  |  |  |  |  |  |  |  |  |  |  |  |  |  |  |  |  |  |  |  |  |  |  |  |  |  |  |  |  |  |  |  |  |
| Mar-14 | 11.3 |  |  |  |  |  |  |  |  |  |  |  |  |  |  |  |  |  |  |  |  |  |  |  |  |  |  |  |  |  |  |  |  |  |  |  |  |  |  |  |  |  |  |  |  |  |  |  |  |  |  |
| Apr-14 | 9.4 |  |  |  |  |  |  |  |  |  |  |  |  |  |  |  |  |  |  |  |  |  |  |  |  |  |  |  |  |  |  |  |  |  |  |  |  |  |  |  |  |  |  |  |  |  |  |  |  |  |  |
| May-14 | 8.6 |  |  |  |  |  |  |  |  |  |  |  |  |  |  |  |  |  |  |  |  |  |  |  |  |  |  |  |  |  |  |  |  |  |  |  |  |  |  |  |  |  |  |  |  |  |  |  |  |  |  |
| Jun-14 | 8.2 |  |  |  |  |  |  |  |  |  |  |  |  |  |  |  |  |  |  |  |  |  |  |  |  |  |  |  |  |  |  |  |  |  |  |  |  |  |  |  |  |  |  |  |  |  |  |  |  |  |  |
| Jul-14 | 7.5 |  |  |  |  |  |  |  |  |  |  |  |  |  |  |  |  |  |  |  |  |  |  |  |  |  |  |  |  |  |  |  |  |  |  |  |  |  |  |  |  |  |  |  |  |  |  |  |  |  |  |
| Aug-14 | 7.7 |  |  |  |  |  |  |  |  |  |  |  |  |  |  |  |  |  |  |  |  |  |  |  |  |  |  |  |  |  |  |  |  |  |  |  |  |  |  |  |  |  |  |  |  |  |  |  |  |  |  |
| Sep-14 | 7 |  |  |  |  |  |  |  |  |  |  |  |  |  |  |  |  |  |  |  |  |  |  |  |  |  |  |  |  |  |  |  |  |  |  |  |  |  |  |  |  |  |  |  |  |  |  |  |  |  |  |
| Oct-14 | 6.4 |  |  |  |  |  |  |  |  |  |  |  |  |  |  |  |  |  |  |  |  |  |  |  |  |  |  |  |  |  |  |  |  |  |  |  |  |  |  |  |  |  |  |  |  |  |  |  |  |  |  |
| Nov-14 | 7.5 |  |  |  |  |  |  |  |  |  |  |  |  |  |  |  |  |  |  |  |  |  |  |  |  |  |  |  |  |  |  |  |  |  |  |  |  |  |  |  |  |  |  |  |  |  |  |  |  |  |  |
| Dec-14 | 8.3 |  |  |  |  |  |  |  |  |  |  |  |  |  |  |  |  |  |  |  |  |  |  |  |  |  |  |  |  |  |  |  |  |  |  |  |  |  |  |  |  |  |  |  |  |  |  |  |  |  |  |
| Jan-15 | 9.8 |  |  |  |  |  |  |  |  |  |  |  |  |  |  |  |  |  |  |  |  |  |  |  |  |  |  |  |  |  |  |  |  |  |  |  |  |  |  |  |  |  |  |  |  |  |  |  |  |  |  |
| Feb-15 | 10.6 |  |  |  |  |  |  |  |  |  |  |  |  |  |  |  |  |  |  |  |  |  |  |  |  |  |  |  |  |  |  |  |  |  |  |  |  |  |  |  |  |  |  |  |  |  |  |  |  |  |  |
| Mar-15 | 9.5 |  |  |  |  |  |  |  |  |  |  |  |  |  |  |  |  |  |  |  |  |  |  |  |  |  |  |  |  |  |  |  |  |  |  |  |  |  |  |  |  |  |  |  |  |  |  |  |  |  |  |
| Apr-15 | 7.5 |  |  |  |  |  |  |  |  |  |  |  |  |  |  |  |  |  |  |  |  |  |  |  |  |  |  |  |  |  |  |  |  |  |  |  |  |  |  |  |  |  |  |  |  |  |  |  |  |  |  |
| May-15 | 6.7 |  |  |  |  |  |  |  |  |  |  |  |  |  |  |  |  |  |  |  |  |  |  |  |  |  |  |  |  |  |  |  |  |  |  |  |  |  |  |  |  |  |  |  |  |  |  |  |  |  |  |
| Jun-15 | 6.3 |  |  |  |  |  |  |  |  |  |  |  |  |  |  |  |  |  |  |  |  |  |  |  |  |  |  |  |  |  |  |  |  |  |  |  |  |  |  |  |  |  |  |  |  |  |  |  |  |  |  |
| Jul-15 | 5.5 |  |  |  |  |  |  |  |  |  |  |  |  |  |  |  |  |  |  |  |  |  |  |  |  |  |  |  |  |  |  |  |  |  |  |  |  |  |  |  |  |  |  |  |  |  |  |  |  |  |  |
| Aug-15 | 6.1 |  |  |  |  |  |  |  |  |  |  |  |  |  |  |  |  |  |  |  |  |  |  |  |  |  |  |  |  |  |  |  |  |  |  |  |  |  |  |  |  |  |  |  |  |  |  |  |  |  |  |
| Sep-15 | 5.5 |  |  |  |  |  |  |  |  |  |  |  |  |  |  |  |  |  |  |  |  |  |  |  |  |  |  |  |  |  |  |  |  |  |  |  |  |  |  |  |  |  |  |  |  |  |  |  |  |  |  |
| Oct-15 | 6.2 |  |  |  |  |  |  |  |  |  |  |  |  |  |  |  |  |  |  |  |  |  |  |  |  |  |  |  |  |  |  |  |  |  |  |  |  |  |  |  |  |  |  |  |  |  |  |  |  |  |  |
| Nov-15 | 6.2 |  |  |  |  |  |  |  |  |  |  |  |  |  |  |  |  |  |  |  |  |  |  |  |  |  |  |  |  |  |  |  |  |  |  |  |  |  |  |  |  |  |  |  |  |  |  |  |  |  |  |
| Dec-15 | 7.5 |  |  |  |  |  |  |  |  |  |  |  |  |  |  |  |  |  |  |  |  |  |  |  |  |  |  |  |  |  |  |  |  |  |  |  |  |  |  |  |  |  |  |  |  |  |  |  |  |  |  |
| Jan-16 | 8.5 |  |  |  |  |  |  |  |  |  |  |  |  |  |  |  |  |  |  |  |  |  |  |  |  |  |  |  |  |  |  |  |  |  |  |  |  |  |  |  |  |  |  |  |  |  |  |  |  |  |  |
| Feb-16 | 8.7 |  |  |  |  |  |  |  |  |  |  |  |  |  |  |  |  |  |  |  |  |  |  |  |  |  |  |  |  |  |  |  |  |  |  |  |  |  |  |  |  |  |  |  |  |  |  |  |  |  |  |
| Mar-16 | 8.7 |  |  |  |  |  |  |  |  |  |  |  |  |  |  |  |  |  |  |  |  |  |  |  |  |  |  |  |  |  |  |  |  |  |  |  |  |  |  |  |  |  |  |  |  |  |  |  |  |  |  |
| Apr-16 | 6 |  |  |  |  |  |  |  |  |  |  |  |  |  |  |  |  |  |  |  |  |  |  |  |  |  |  |  |  |  |  |  |  |  |  |  |  |  |  |  |  |  |  |  |  |  |  |  |  |  |  |
| May-16 | 5.2 |  |  |  |  |  |  |  |  |  |  |  |  |  |  |  |  |  |  |  |  |  |  |  |  |  |  |  |  |  |  |  |  |  |  |  |  |  |  |  |  |  |  |  |  |  |  |  |  |  |  |
| Jun-16 | 4.6 |  |  |  |  |  |  |  |  |  |  |  |  |  |  |  |  |  |  |  |  |  |  |  |  |  |  |  |  |  |  |  |  |  |  |  |  |  |  |  |  |  |  |  |  |  |  |  |  |  |  |
| Jul-16 | 4.5 |  |  |  |  |  |  |  |  |  |  |  |  |  |  |  |  |  |  |  |  |  |  |  |  |  |  |  |  |  |  |  |  |  |  |  |  |  |  |  |  |  |  |  |  |  |  |  |  |  |  |
| Aug-16 | 5.1 |  |  |  |  |  |  |  |  |  |  |  |  |  |  |  |  |  |  |  |  |  |  |  |  |  |  |  |  |  |  |  |  |  |  |  |  |  |  |  |  |  |  |  |  |  |  |  |  |  |  |
| Sep-16 | 5.2 |  |  |  |  |  |  |  |  |  |  |  |  |  |  |  |  |  |  |  |  |  |  |  |  |  |  |  |  |  |  |  |  |  |  |  |  |  |  |  |  |  |  |  |  |  |  |  |  |  |  |
| Oct-16 | 5.7 |  |  |  |  |  |  |  |  |  |  |  |  |  |  |  |  |  |  |  |  |  |  |  |  |  |  |  |  |  |  |  |  |  |  |  |  |  |  |  |  |  |  |  |  |  |  |  |  |  |  |
| Nov-16 | 5.7 |  |  |  |  |  |  |  |  |  |  |  |  |  |  |  |  |  |  |  |  |  |  |  |  |  |  |  |  |  |  |  |  |  |  |  |  |  |  |  |  |  |  |  |  |  |  |  |  |  |  |
| Dec-16 | 7.4 |  |  |  |  |  |  |  |  |  |  |  |  |  |  |  |  |  |  |  |  |  |  |  |  |  |  |  |  |  |  |  |  |  |  |  |  |  |  |  |  |  |  |  |  |  |  |  |  |  |  |
| Jan-17 | 9.4 |  |  |  |  |  |  |  |  |  |  |  |  |  |  |  |  |  |  |  |  |  |  |  |  |  |  |  |  |  |  |  |  |  |  |  |  |  |  |  |  |  |  |  |  |  |  |  |  |  |  |
| Feb-17 | 8.8 |  |  |  |  |  |  |  |  |  |  |  |  |  |  |  |  |  |  |  |  |  |  |  |  |  |  |  |  |  |  |  |  |  |  |  |  |  |  |  |  |  |  |  |  |  |  |  |  |  |  |
| Mar-17 | 8.4 |  |  |  |  |  |  |  |  |  |  |  |  |  |  |  |  |  |  |  |  |  |  |  |  |  |  |  |  |  |  |  |  |  |  |  |  |  |  |  |  |  |  |  |  |  |  |  |  |  |  |
| Apr-17 | 6.3 |  |  |  |  |  |  |  |  |  |  |  |  |  |  |  |  |  |  |  |  |  |  |  |  |  |  |  |  |  |  |  |  |  |  |  |  |  |  |  |  |  |  |  |  |  |  |  |  |  |  |
| May-17 | 5.3 |  |  |  |  |  |  |  |  |  |  |  |  |  |  |  |  |  |  |  |  |  |  |  |  |  |  |  |  |  |  |  |  |  |  |  |  |  |  |  |  |  |  |  |  |  |  |  |  |  |  |
| Jun-17 | 4.5 |  |  |  |  |  |  |  |  |  |  |  |  |  |  |  |  |  |  |  |  |  |  |  |  |  |  |  |  |  |  |  |  |  |  |  |  |  |  |  |  |  |  |  |  |  |  |  |  |  |  |
| Jul-17 | 4.9 |  |  |  |  |  |  |  |  |  |  |  |  |  |  |  |  |  |  |  |  |  |  |  |  |  |  |  |  |  |  |  |  |  |  |  |  |  |  |  |  |  |  |  |  |  |  |  |  |  |  |
| Aug-17 | 4.7 |  |  |  |  |  |  |  |  |  |  |  |  |  |  |  |  |  |  |  |  |  |  |  |  |  |  |  |  |  |  |  |  |  |  |  |  |  |  |  |  |  |  |  |  |  |  |  |  |  |  |
| Sep-17 | 4.7 |  |  |  |  |  |  |  |  |  |  |  |  |  |  |  |  |  |  |  |  |  |  |  |  |  |  |  |  |  |  |  |  |  |  |  |  |  |  |  |  |  |  |  |  |  |  |  |  |  |  |
| Oct-17 | 4.5 |  |  |  |  |  |  |  |  |  |  |  |  |  |  |  |  |  |  |  |  |  |  |  |  |  |  |  |  |  |  |  |  |  |  |  |  |  |  |  |  |  |  |  |  |  |  |  |  |  |  |
| Nov-17 | 5 |  |  |  |  |  |  |  |  |  |  |  |  |  |  |  |  |  |  |  |  |  |  |  |  |  |  |  |  |  |  |  |  |  |  |  |  |  |  |  |  |  |  |  |  |  |  |  |  |  |  |
| Dec-17 | 5.9 |  |  |  |  |  |  |  |  |  |  |  |  |  |  |  |  |  |  |  |  |  |  |  |  |  |  |  |  |  |  |  |  |  |  |  |  |  |  |  |  |  |  |  |  |  |  |  |  |  |  |
| Jan-18 | 7.3 |  |  |  |  |  |  |  |  |  |  |  |  |  |  |  |  |  |  |  |  |  |  |  |  |  |  |  |  |  |  |  |  |  |  |  |  |  |  |  |  |  |  |  |  |  |  |  |  |  |  |
| Feb-18 | 7.8 |  |  |  |  |  |  |  |  |  |  |  |  |  |  |  |  |  |  |  |  |  |  |  |  |  |  |  |  |  |  |  |  |  |  |  |  |  |  |  |  |  |  |  |  |  |  |  |  |  |  |
| Mar-18 | 7.4 |  |  |  |  |  |  |  |  |  |  |  |  |  |  |  |  |  |  |  |  |  |  |  |  |  |  |  |  |  |  |  |  |  |  |  |  |  |  |  |  |  |  |  |  |  |  |  |  |  |  |
| Apr-18 | 6.5 |  |  |  |  |  |  |  |  |  |  |  |  |  |  |  |  |  |  |  |  |  |  |  |  |  |  |  |  |  |  |  |  |  |  |  |  |  |  |  |  |  |  |  |  |  |  |  |  |  |  |
| May-18 | 4.4 |  |  |  |  |  |  |  |  |  |  |  |  |  |  |  |  |  |  |  |  |  |  |  |  |  |  |  |  |  |  |  |  |  |  |  |  |  |  |  |  |  |  |  |  |  |  |  |  |  |  |
| Jun-18 | 4.7 |  |  |  |  |  |  |  |  |  |  |  |  |  |  |  |  |  |  |  |  |  |  |  |  |  |  |  |  |  |  |  |  |  |  |  |  |  |  |  |  |  |  |  |  |  |  |  |  |  |  |
| Jul-18 | 3.4 |  |  |  |  |  |  |  |  |  |  |  |  |  |  |  |  |  |  |  |  |  |  |  |  |  |  |  |  |  |  |  |  |  |  |  |  |  |  |  |  |  |  |  |  |  |  |  |  |  |  |
| Aug-18 | 3.4 |  |  |  |  |  |  |  |  |  |  |  |  |  |  |  |  |  |  |  |  |  |  |  |  |  |  |  |  |  |  |  |  |  |  |  |  |  |  |  |  |  |  |  |  |  |  |  |  |  |  |
| Sep-18 | 4.1 |  |  |  |  |  |  |  |  |  |  |  |  |  |  |  |  |  |  |  |  |  |  |  |  |  |  |  |  |  |  |  |  |  |  |  |  |  |  |  |  |  |  |  |  |  |  |  |  |  |  |
| Oct-18 | 3.6 |  |  |  |  |  |  |  |  |  |  |  |  |  |  |  |  |  |  |  |  |  |  |  |  |  |  |  |  |  |  |  |  |  |  |  |  |  |  |  |  |  |  |  |  |  |  |  |  |  |  |
| Nov-18 | 3.9 |  |  |  |  |  |  |  |  |  |  |  |  |  |  |  |  |  |  |  |  |  |  |  |  |  |  |  |  |  |  |  |  |  |  |  |  |  |  |  |  |  |  |  |  |  |  |  |  |  |  |
| Dec-18 | 5.1 |  |  |  |  |  |  |  |  |  |  |  |  |  |  |  |  |  |  |  |  |  |  |  |  |  |  |  |  |  |  |  |  |  |  |  |  |  |  |  |  |  |  |  |  |  |  |  |  |  |  |
| Jan-19 | 6.4 |  |  |  |  |  |  |  |  |  |  |  |  |  |  |  |  |  |  |  |  |  |  |  |  |  |  |  |  |  |  |  |  |  |  |  |  |  |  |  |  |  |  |  |  |  |  |  |  |  |  |
| Feb-19 | 6.2 |  |  |  |  |  |  |  |  |  |  |  |  |  |  |  |  |  |  |  |  |  |  |  |  |  |  |  |  |  |  |  |  |  |  |  |  |  |  |  |  |  |  |  |  |  |  |  |  |  |  |
| Mar-19 | 5.2 |  |  |  |  |  |  |  |  |  |  |  |  |  |  |  |  |  |  |  |  |  |  |  |  |  |  |  |  |  |  |  |  |  |  |  |  |  |  |  |  |  |  |  |  |  |  |  |  |  |  |
| Apr-19 | 4.7 |  |  |  |  |  |  |  |  |  |  |  |  |  |  |  |  |  |  |  |  |  |  |  |  |  |  |  |  |  |  |  |  |  |  |  |  |  |  |  |  |  |  |  |  |  |  |  |  |  |  |
| May-19 | 3.2 |  |  |  |  |  |  |  |  |  |  |  |  |  |  |  |  |  |  |  |  |  |  |  |  |  |  |  |  |  |  |  |  |  |  |  |  |  |  |  |  |  |  |  |  |  |  |  |  |  |  |
| Jun-19 | 4 |  |  |  |  |  |  |  |  |  |  |  |  |  |  |  |  |  |  |  |  |  |  |  |  |  |  |  |  |  |  |  |  |  |  |  |  |  |  |  |  |  |  |  |  |  |  |  |  |  |  |
| Jul-19 | 3.8 |  |  |  |  |  |  |  |  |  |  |  |  |  |  |  |  |  |  |  |  |  |  |  |  |  |  |  |  |  |  |  |  |  |  |  |  |  |  |  |  |  |  |  |  |  |  |  |  |  |  |
| Aug-19 | 3.6 |  |  |  |  |  |  |  |  |  |  |  |  |  |  |  |  |  |  |  |  |  |  |  |  |  |  |  |  |  |  |  |  |  |  |  |  |  |  |  |  |  |  |  |  |  |  |  |  |  |  |
| Sep-19 | 3.2 |  |  |  |  |  |  |  |  |  |  |  |  |  |  |  |  |  |  |  |  |  |  |  |  |  |  |  |  |  |  |  |  |  |  |  |  |  |  |  |  |  |  |  |  |  |  |  |  |  |  |
| Oct-19 | 4 |  |  |  |  |  |  |  |  |  |  |  |  |  |  |  |  |  |  |  |  |  |  |  |  |  |  |  |  |  |  |  |  |  |  |  |  |  |  |  |  |  |  |  |  |  |  |  |  |  |  |
| Nov-19 | 4.4 |  |  |  |  |  |  |  |  |  |  |  |  |  |  |  |  |  |  |  |  |  |  |  |  |  |  |  |  |  |  |  |  |  |  |  |  |  |  |  |  |  |  |  |  |  |  |  |  |  |  |
| Dec-19 | 5 |  |  |  |  |  |  |  |  |  |  |  |  |  |  |  |  |  |  |  |  |  |  |  |  |  |  |  |  |  |  |  |  |  |  |  |  |  |  |  |  |  |  |  |  |  |  |  |  |  |  |
| Jan-20 | 5.4 |  |  |  |  |  |  |  |  |  |  |  |  |  |  |  |  |  |  |  |  |  |  |  |  |  |  |  |  |  |  |  |  |  |  |  |  |  |  |  |  |  |  |  |  |  |  |  |  |  |  |
| Feb-20 | 5.5 |  |  |  |  |  |  |  |  |  |  |  |  |  |  |  |  |  |  |  |  |  |  |  |  |  |  |  |  |  |  |  |  |  |  |  |  |  |  |  |  |  |  |  |  |  |  |  |  |  |  |
| Mar-20 | 6.9 |  |  |  |  |  |  |  |  |  |  |  |  |  |  |  |  |  |  |  |  |  |  |  |  |  |  |  |  |  |  |  |  |  |  |  |  |  |  |  |  |  |  |  |  |  |  |  |  |  |  |
| Apr-20 | 16.6 |  |  |  |  |  |  |  |  |  |  |  |  |  |  |  |  |  |  |  |  |  |  |  |  |  |  |  |  |  |  |  |  |  |  |  |  |  |  |  |  |  |  |  |  |  |  |  |  |  |  |
| May-20 | 12.7 |  |  |  |  |  |  |  |  |  |  |  |  |  |  |  |  |  |  |  |  |  |  |  |  |  |  |  |  |  |  |  |  |  |  |  |  |  |  |  |  |  |  |  |  |  |  |  |  |  |  |
| Jun-20 | 10.1 |  |  |  |  |  |  |  |  |  |  |  |  |  |  |  |  |  |  |  |  |  |  |  |  |  |  |  |  |  |  |  |  |  |  |  |  |  |  |  |  |  |  |  |  |  |  |  |  |  |  |
| Jul-20 | 8.9 |  |  |  |  |  |  |  |  |  |  |  |  |  |  |  |  |  |  |  |  |  |  |  |  |  |  |  |  |  |  |  |  |  |  |  |  |  |  |  |  |  |  |  |  |  |  |  |  |  |  |
| Aug-20 | 7.6 |  |  |  |  |  |  |  |  |  |  |  |  |  |  |  |  |  |  |  |  |  |  |  |  |  |  |  |  |  |  |  |  |  |  |  |  |  |  |  |  |  |  |  |  |  |  |  |  |  |  |
| Sep-20 | 7.1 |  |  |  |  |  |  |  |  |  |  |  |  |  |  |  |  |  |  |  |  |  |  |  |  |  |  |  |  |  |  |  |  |  |  |  |  |  |  |  |  |  |  |  |  |  |  |  |  |  |  |
| Oct-20 | 6.8 |  |  |  |  |  |  |  |  |  |  |  |  |  |  |  |  |  |  |  |  |  |  |  |  |  |  |  |  |  |  |  |  |  |  |  |  |  |  |  |  |  |  |  |  |  |  |  |  |  |  |
| Nov-20 | 7.3 |  |  |  |  |  |  |  |  |  |  |  |  |  |  |  |  |  |  |  |  |  |  |  |  |  |  |  |  |  |  |  |  |  |  |  |  |  |  |  |  |  |  |  |  |  |  |  |  |  |  |
| Dec-20 | 9.6 |  |  |  |  |  |  |  |  |  |  |  |  |  |  |  |  |  |  |  |  |  |  |  |  |  |  |  |  |  |  |  |  |  |  |  |  |  |  |  |  |  |  |  |  |  |  |  |  |  |  |
| Jan-21 | 9.4 |  |  |  |  |  |  |  |  |  |  |  |  |  |  |  |  |  |  |  |  |  |  |  |  |  |  |  |  |  |  |  |  |  |  |  |  |  |  |  |  |  |  |  |  |  |  |  |  |  |  |
| Feb-21 | 9.6 |  |  |  |  |  |  |  |  |  |  |  |  |  |  |  |  |  |  |  |  |  |  |  |  |  |  |  |  |  |  |  |  |  |  |  |  |  |  |  |  |  |  |  |  |  |  |  |  |  |  |
| Mar-21 | 8.6 |  |  |  |  |  |  |  |  |  |  |  |  |  |  |  |  |  |  |  |  |  |  |  |  |  |  |  |  |  |  |  |  |  |  |  |  |  |  |  |  |  |  |  |  |  |  |  |  |  |  |
| Apr-21 | 7.7 |  |  |  |  |  |  |  |  |  |  |  |  |  |  |  |  |  |  |  |  |  |  |  |  |  |  |  |  |  |  |  |  |  |  |  |  |  |  |  |  |  |  |  |  |  |  |  |  |  |  |
| May-21 | 6.7 |  |  |  |  |  |  |  |  |  |  |  |  |  |  |  |  |  |  |  |  |  |  |  |  |  |  |  |  |  |  |  |  |  |  |  |  |  |  |  |  |  |  |  |  |  |  |  |  |  |  |
| Jun-21 | 7.5 |  |  |  |  |  |  |  |  |  |  |  |  |  |  |  |  |  |  |  |  |  |  |  |  |  |  |  |  |  |  |  |  |  |  |  |  |  |  |  |  |  |  |  |  |  |  |  |  |  |  |
| Jul-21 | 6.1 |  |  |  |  |  |  |  |  |  |  |  |  |  |  |  |  |  |  |  |  |  |  |  |  |  |  |  |  |  |  |  |  |  |  |  |  |  |  |  |  |  |  |  |  |  |  |  |  |  |  |
| Aug-21 | 4.6 |  |  |  |  |  |  |  |  |  |  |  |  |  |  |  |  |  |  |  |  |  |  |  |  |  |  |  |  |  |  |  |  |  |  |  |  |  |  |  |  |  |  |  |  |  |  |  |  |  |  |
| Sep-21 | 4.5 |  |  |  |  |  |  |  |  |  |  |  |  |  |  |  |  |  |  |  |  |  |  |  |  |  |  |  |  |  |  |  |  |  |  |  |  |  |  |  |  |  |  |  |  |  |  |  |  |  |  |
| Oct-21 | 4 |  |  |  |  |  |  |  |  |  |  |  |  |  |  |  |  |  |  |  |  |  |  |  |  |  |  |  |  |  |  |  |  |  |  |  |  |  |  |  |  |  |  |  |  |  |  |  |  |  |  |
| Nov-21 | 4.7 |  |  |  |  |  |  |  |  |  |  |  |  |  |  |  |  |  |  |  |  |  |  |  |  |  |  |  |  |  |  |  |  |  |  |  |  |  |  |  |  |  |  |  |  |  |  |  |  |  |  |
| Dec-21 | 5 |  |  |  |  |  |  |  |  |  |  |  |  |  |  |  |  |  |  |  |  |  |  |  |  |  |  |  |  |  |  |  |  |  |  |  |  |  |  |  |  |  |  |  |  |  |  |  |  |  |  |
| Jan-22 | 7.1 |  |  |  |  |  |  |  |  |  |  |  |  |  |  |  |  |  |  |  |  |  |  |  |  |  |  |  |  |  |  |  |  |  |  |  |  |  |  |  |  |  |  |  |  |  |  |  |  |  |  |
| Feb-22 | 6.7 |  |  |  |  |  |  |  |  |  |  |  |  |  |  |  |  |  |  |  |  |  |  |  |  |  |  |  |  |  |  |  |  |  |  |  |  |  |  |  |  |  |  |  |  |  |  |  |  |  |  |
| Mar-22 | 6 |  |  |  |  |  |  |  |  |  |  |  |  |  |  |  |  |  |  |  |  |  |  |  |  |  |  |  |  |  |  |  |  |  |  |  |  |  |  |  |  |  |  |  |  |  |  |  |  |  |  |
| Apr-22 | 4.6 |  |  |  |  |  |  |  |  |  |  |  |  |  |  |  |  |  |  |  |  |  |  |  |  |  |  |  |  |  |  |  |  |  |  |  |  |  |  |  |  |  |  |  |  |  |  |  |  |  |  |
| May-22 | 3.8 |  |  |  |  |  |  |  |  |  |  |  |  |  |  |  |  |  |  |  |  |  |  |  |  |  |  |  |  |  |  |  |  |  |  |  |  |  |  |  |  |  |  |  |  |  |  |  |  |  |  |
| Jun-22 | 3.7 |  |  |  |  |  |  |  |  |  |  |  |  |  |  |  |  |  |  |  |  |  |  |  |  |  |  |  |  |  |  |  |  |  |  |  |  |  |  |  |  |  |  |  |  |  |  |  |  |  |  |